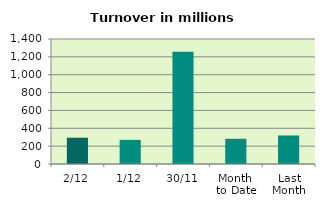
| Category | Series 0 |
|---|---|
| 2/12 | 294.234 |
| 1/12 | 270.109 |
| 30/11 | 1258.162 |
| Month 
to Date | 282.172 |
| Last
Month | 319.611 |